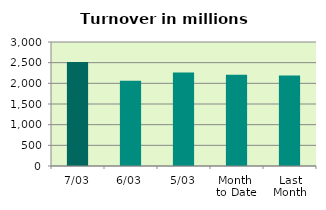
| Category | Series 0 |
|---|---|
| 7/03 | 2514.916 |
| 6/03 | 2064.3 |
| 5/03 | 2265.08 |
| Month 
to Date | 2206.99 |
| Last
Month | 2191.938 |